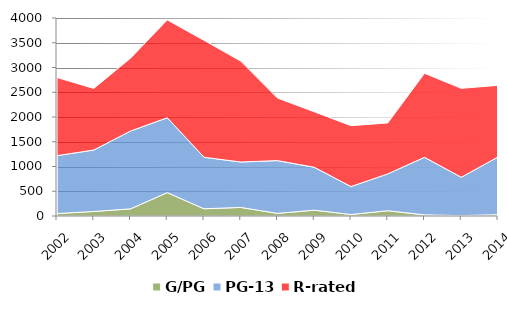
| Category | G/PG | PG-13 | R-rated |
|---|---|---|---|
| 2002.0 | 50 | 1169 | 1579 |
| 2003.0 | 91 | 1242 | 1245 |
| 2004.0 | 144 | 1572 | 1472 |
| 2005.0 | 472 | 1513 | 1977 |
| 2006.0 | 146 | 1041 | 2362 |
| 2007.0 | 173 | 918 | 2038 |
| 2008.0 | 53 | 1066 | 1263 |
| 2009.0 | 118 | 867 | 1121 |
| 2010.0 | 30 | 565 | 1230 |
| 2011.0 | 107 | 744 | 1029 |
| 2012.0 | 23 | 1163 | 1697 |
| 2013.0 | 8 | 775 | 1796 |
| 2014.0 | 27 | 1165 | 1447 |